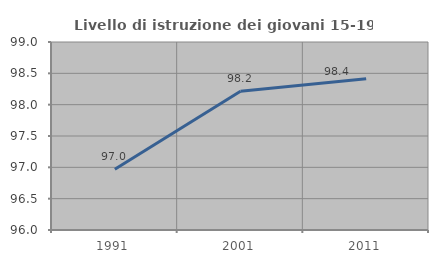
| Category | Livello di istruzione dei giovani 15-19 anni |
|---|---|
| 1991.0 | 96.97 |
| 2001.0 | 98.214 |
| 2011.0 | 98.413 |